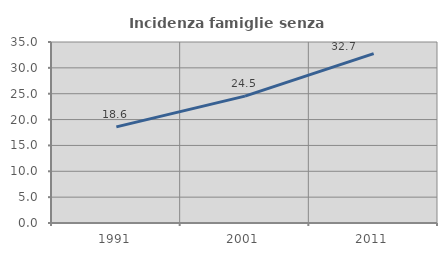
| Category | Incidenza famiglie senza nuclei |
|---|---|
| 1991.0 | 18.583 |
| 2001.0 | 24.534 |
| 2011.0 | 32.745 |